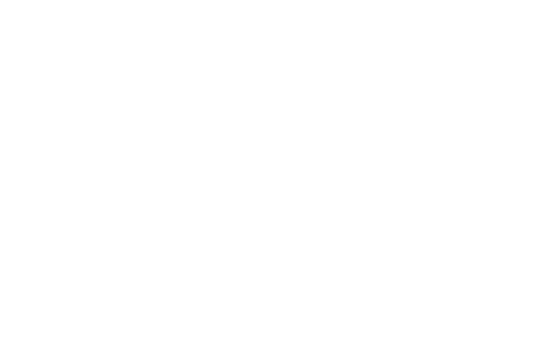
| Category | Series 0 |
|---|---|
| lighting and appliances | 0 |
| heating | 0 |
| commuting | 0 |
| social travel | 0 |
| car ownership | 0 |
| flights | 0 |
| food | 0 |
| pets | 0 |
| spending | 0 |